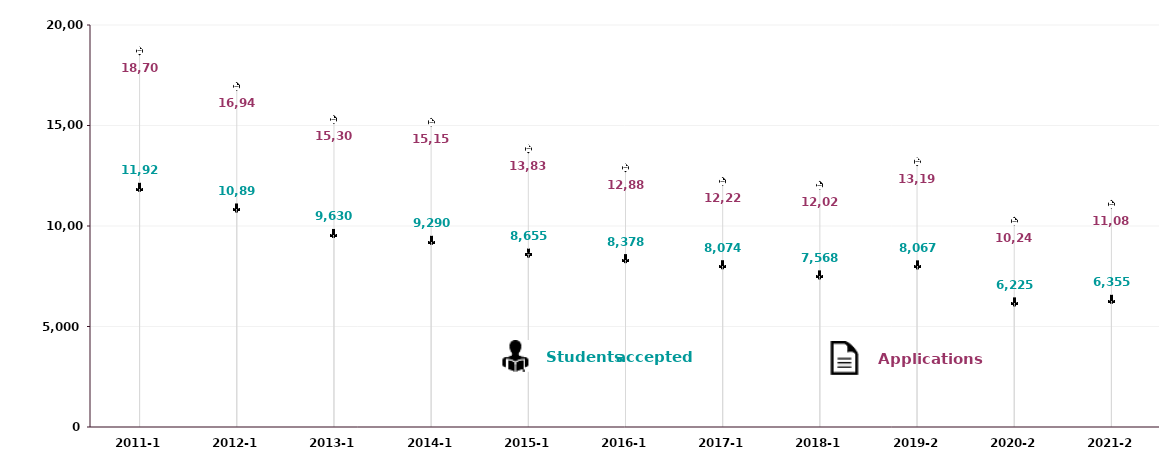
| Category | Applications | Students Accepted |
|---|---|---|
| 2011-12 | 18707 | 11927 |
| 2012-13 | 16944 | 10897 |
| 2013-14 | 15300 | 9630 |
| 2014-15 | 15157 | 9290 |
| 2015-16 | 13833 | 8655 |
| 2016-17 | 12889 | 8378 |
| 2017-18 | 12221 | 8074 |
| 2018-19 | 12028 | 7568 |
| 2019-20 | 13198 | 8067 |
| 2020-21 | 10242 | 6225 |
| 2021-22 | 11082 | 6355 |